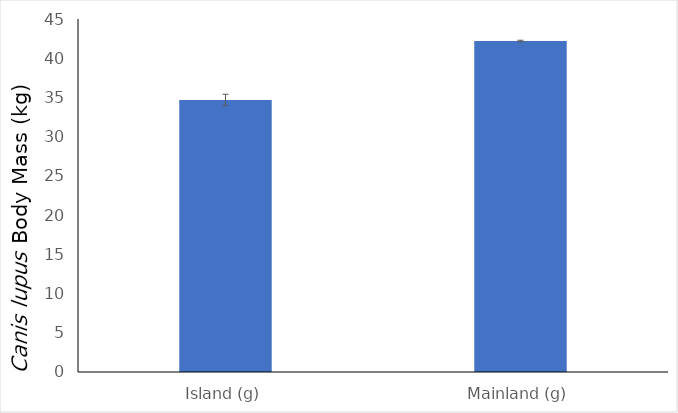
| Category | Series 0 |
|---|---|
| Island (g) | 34.68 |
| Mainland (g) | 42.185 |